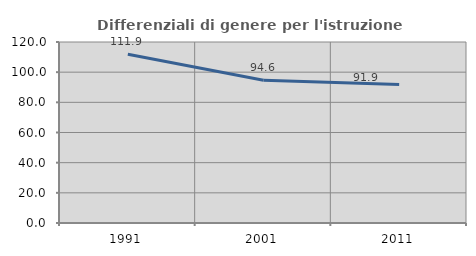
| Category | Differenziali di genere per l'istruzione superiore |
|---|---|
| 1991.0 | 111.854 |
| 2001.0 | 94.602 |
| 2011.0 | 91.897 |